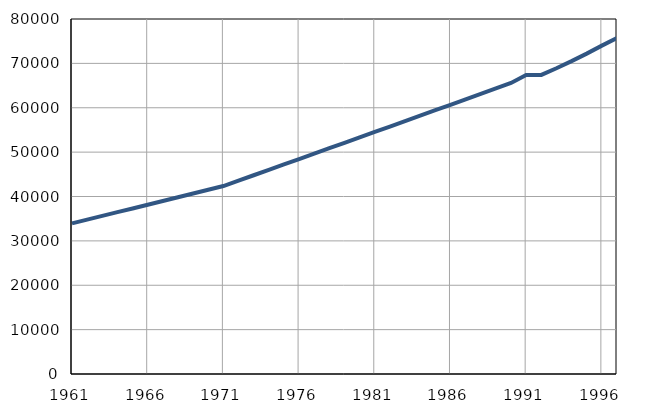
| Category | Population
size |
|---|---|
| 1961.0 | 33946 |
| 1962.0 | 34787 |
| 1963.0 | 35628 |
| 1964.0 | 36469 |
| 1965.0 | 37310 |
| 1966.0 | 38151 |
| 1967.0 | 38992 |
| 1968.0 | 39833 |
| 1969.0 | 40674 |
| 1970.0 | 41515 |
| 1971.0 | 42351 |
| 1972.0 | 43570 |
| 1973.0 | 44789 |
| 1974.0 | 46008 |
| 1975.0 | 47227 |
| 1976.0 | 48446 |
| 1977.0 | 49665 |
| 1978.0 | 50884 |
| 1979.0 | 52103 |
| 1980.0 | 53322 |
| 1981.0 | 54539 |
| 1982.0 | 55766 |
| 1983.0 | 56993 |
| 1984.0 | 58220 |
| 1985.0 | 59447 |
| 1986.0 | 60674 |
| 1987.0 | 61901 |
| 1988.0 | 63128 |
| 1989.0 | 64355 |
| 1990.0 | 65582 |
| 1991.0 | 67400 |
| 1992.0 | 67400 |
| 1993.0 | 68900 |
| 1994.0 | 70500 |
| 1995.0 | 72200 |
| 1996.0 | 74000 |
| 1997.0 | 75700 |